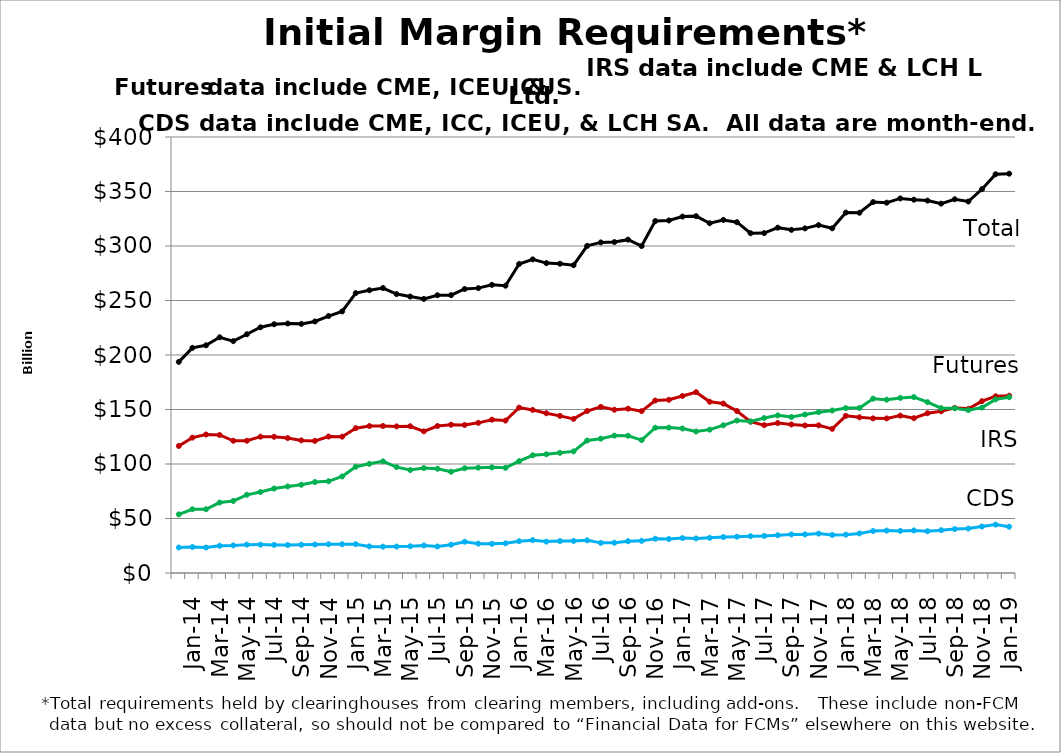
| Category | CDS | Futures | IRS | Total |
|---|---|---|---|---|
|   |  |  |  |  |
| Jan-14 |  |  |  |  |
|   |  |  |  |  |
| Mar-14 |  |  |  |  |
|   |  |  |  |  |
| May-14 |  |  |  |  |
|   |  |  |  |  |
| Jul-14 |  |  |  |  |
|   |  |  |  |  |
| Sep-14 |  |  |  |  |
|   |  |  |  |  |
| Nov-14 |  |  |  |  |
|   |  |  |  |  |
| Jan-15 |  |  |  |  |
|   |  |  |  |  |
| Mar-15 |  |  |  |  |
|   |  |  |  |  |
| May-15 |  |  |  |  |
|   |  |  |  |  |
| Jul-15 |  |  |  |  |
|   |  |  |  |  |
| Sep-15 |  |  |  |  |
|   |  |  |  |  |
| Nov-15 |  |  |  |  |
|   |  |  |  |  |
| Jan-16 |  |  |  |  |
|   |  |  |  |  |
| Mar-16 |  |  |  |  |
|   |  |  |  |  |
| May-16 |  |  |  |  |
|   |  |  |  |  |
| Jul-16 |  |  |  |  |
|   |  |  |  |  |
| Sep-16 |  |  |  |  |
|   |  |  |  |  |
| Nov-16 |  |  |  |  |
|   |  |  |  |  |
| Jan-17 |  |  |  |  |
|   |  |  |  |  |
| Mar-17 |  |  |  |  |
|   |  |  |  |  |
| May-17 |  |  |  |  |
|   |  |  |  |  |
| Jul-17 |  |  |  |  |
|   |  |  |  |  |
| Sep-17 |  |  |  |  |
|   |  |  |  |  |
| Nov-17 |  |  |  |  |
|   |  |  |  |  |
| Jan-18 |  |  |  |  |
|   |  |  |  |  |
| Mar-18 |  |  |  |  |
|   |  |  |  |  |
| May-18 |  |  |  |  |
|   |  |  |  |  |
| Jul-18 |  |  |  |  |
|   |  |  |  |  |
| Sep-18 |  |  |  |  |
|   |  |  |  |  |
| Nov-18 |  |  |  |  |
|   |  |  |  |  |
| Jan-19 |  |  |  |  |